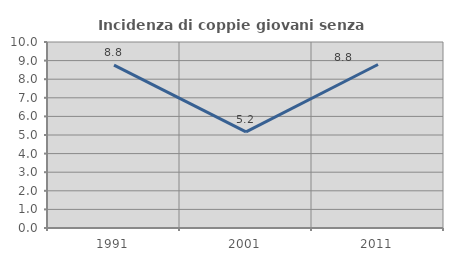
| Category | Incidenza di coppie giovani senza figli |
|---|---|
| 1991.0 | 8.76 |
| 2001.0 | 5.17 |
| 2011.0 | 8.79 |